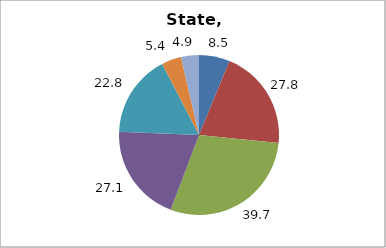
| Category | Series 0 |
|---|---|
| Higher Education | 8.477 |
| Elementary and Secondary Education | 27.776 |
| Total Education1 | 39.727 |
| Social Welfare2 | 27.066 |
| Transportation, Public Safety, Environment and Housing3 | 22.842 |
| Administration | 5.442 |
| Other4 | 4.923 |